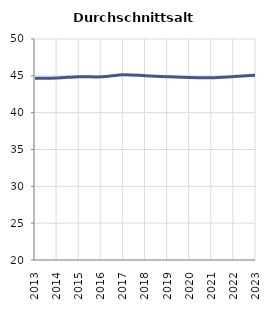
| Category | Durchschnittsalter |
|---|---|
| 2013.0 | 44.678 |
| 2014.0 | 44.707 |
| 2015.0 | 44.88 |
| 2016.0 | 44.862 |
| 2017.0 | 45.144 |
| 2018.0 | 45.021 |
| 2019.0 | 44.877 |
| 2020.0 | 44.77 |
| 2021.0 | 44.751 |
| 2022.0 | 44.9 |
| 2023.0 | 45.073 |